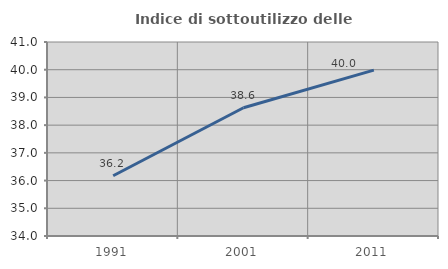
| Category | Indice di sottoutilizzo delle abitazioni  |
|---|---|
| 1991.0 | 36.174 |
| 2001.0 | 38.627 |
| 2011.0 | 39.984 |